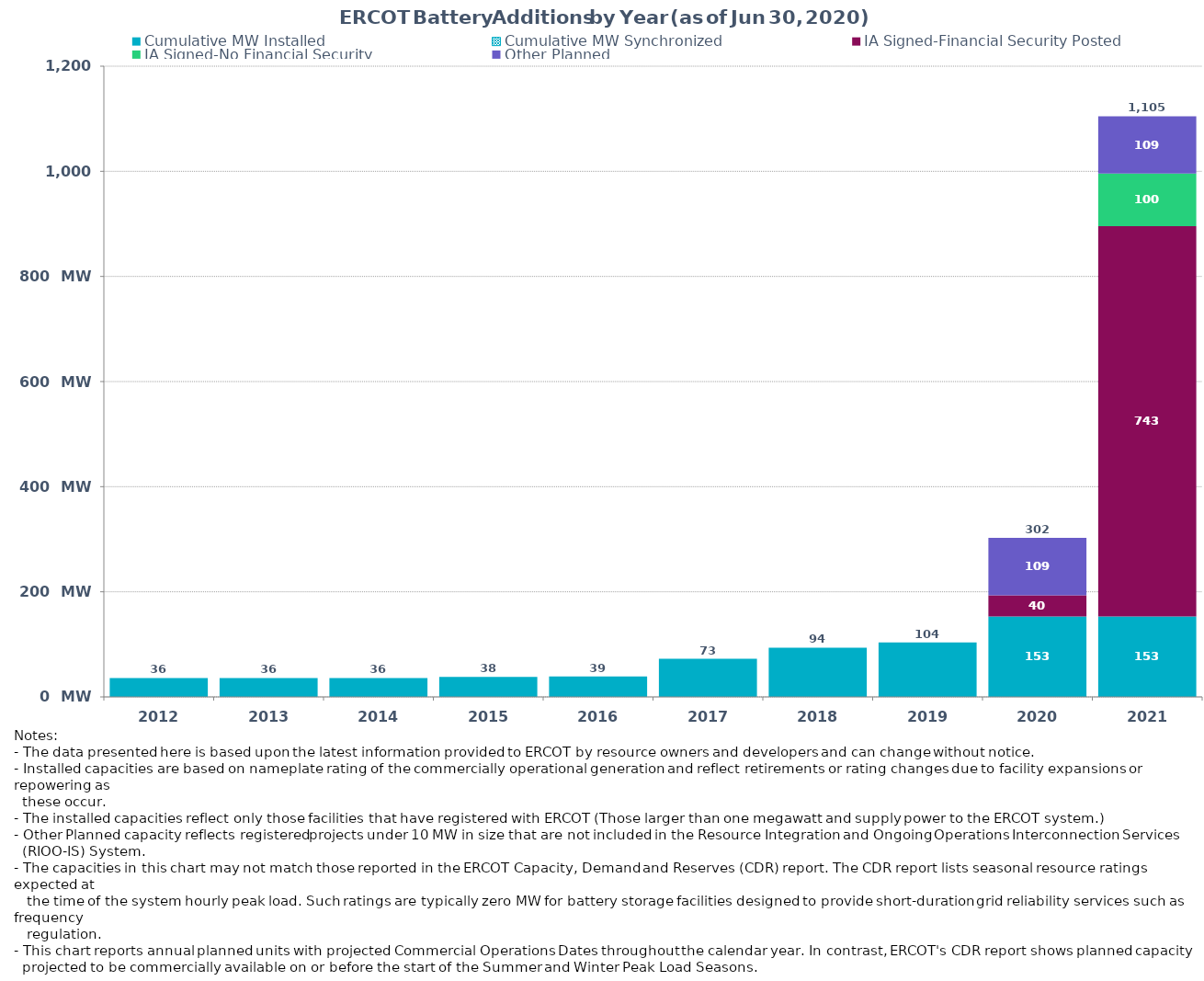
| Category | Cumulative MW Installed | Cumulative MW Synchronized | IA Signed-Financial Security Posted  | IA Signed-No Financial Security  | Other Planned | Cumulative Installed and Planned |
|---|---|---|---|---|---|---|
| 2012.0 | 36 | 0 | 0 | 0 | 0 | 36 |
| 2013.0 | 36 | 0 | 0 | 0 | 0 | 36 |
| 2014.0 | 36 | 0 | 0 | 0 | 0 | 36 |
| 2015.0 | 38 | 0 | 0 | 0 | 0 | 38 |
| 2016.0 | 39 | 0 | 0 | 0 | 0 | 39 |
| 2017.0 | 72.5 | 0 | 0 | 0 | 0 | 72.5 |
| 2018.0 | 93.8 | 0 | 0 | 0 | 0 | 93.8 |
| 2019.0 | 103.7 | 0 | 0 | 0 | 0 | 103.7 |
| 2020.0 | 153.2 | 0 | 40.26 | 0 | 109 | 302.46 |
| 2021.0 | 153.2 | 0 | 742.5 | 100 | 109 | 1104.7 |